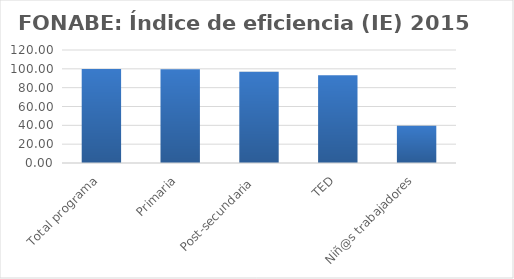
| Category | Índice de eficiencia (IE)  |
|---|---|
| Total programa | 99.901 |
| Primaria | 99.642 |
| Post-secundaria  | 96.816 |
| TED | 93.069 |
| Niñ@s trabajadores | 39.508 |